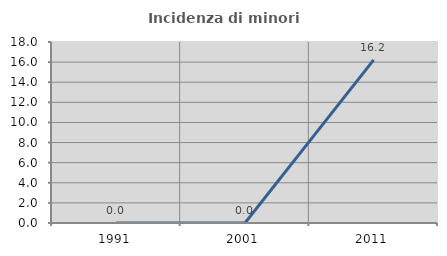
| Category | Incidenza di minori stranieri |
|---|---|
| 1991.0 | 0 |
| 2001.0 | 0 |
| 2011.0 | 16.216 |